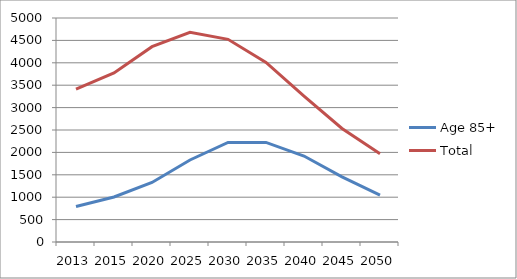
| Category | Age 85+ | Total |
|---|---|---|
| 2013.0 | 791.666 | 3410.89 |
| 2015.0 | 1005.694 | 3772.757 |
| 2020.0 | 1327.795 | 4359.159 |
| 2025.0 | 1831.042 | 4679.966 |
| 2030.0 | 2222.539 | 4523.812 |
| 2035.0 | 2223.113 | 4009.241 |
| 2040.0 | 1919.358 | 3255.936 |
| 2045.0 | 1454.833 | 2533.471 |
| 2050.0 | 1047.941 | 1970.55 |